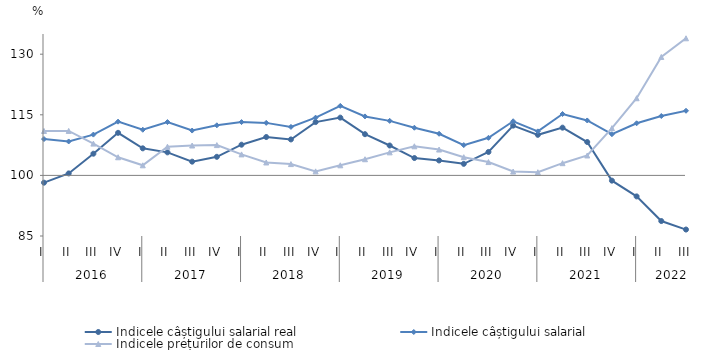
| Category | Indicele câștigului salarial real | Indicele câștigului salarial | Indicele prețurilor de consum |
|---|---|---|---|
| 0 | 98.2 | 109 | 111 |
| 1 | 100.491 | 108.4 | 111.01 |
| 2 | 105.369 | 110.1 | 107.87 |
| 3 | 110.537 | 113.3 | 104.49 |
| 4 | 106.7 | 111.3 | 102.5 |
| 5 | 105.7 | 113.2 | 107.1 |
| 6 | 103.4 | 111.1 | 107.4 |
| 7 | 104.6 | 112.4 | 107.5 |
| 8 | 107.6 | 113.2 | 105.2 |
| 9 | 109.5 | 113 | 103.2 |
| 10 | 108.9 | 112 | 102.8 |
| 11 | 113.2 | 114.3 | 101 |
| 12 | 114.3 | 117.2 | 102.5 |
| 13 | 110.2 | 114.6 | 104 |
| 14 | 107.4 | 113.5 | 105.7 |
| 15 | 104.3 | 111.8 | 107.2 |
| 16 | 103.7 | 110.3 | 106.4 |
| 17 | 102.861 | 107.5 | 104.51 |
| 18 | 105.8 | 109.3 | 103.3 |
| 19 | 112.322 | 113.4 | 100.96 |
| 20 | 110.042 | 110.9 | 100.78 |
| 21 | 111.816 | 115.2 | 103.026 |
| 22 | 108.263 | 113.6 | 104.93 |
| 23 | 98.7 | 110.2 | 111.7 |
| 24 | 94.8 | 112.9 | 119.1 |
| 25 | 88.7 | 114.7 | 129.32 |
| 26 | 86.6 | 116 | 133.938 |